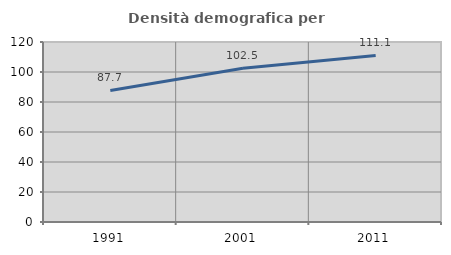
| Category | Densità demografica |
|---|---|
| 1991.0 | 87.717 |
| 2001.0 | 102.516 |
| 2011.0 | 111.067 |